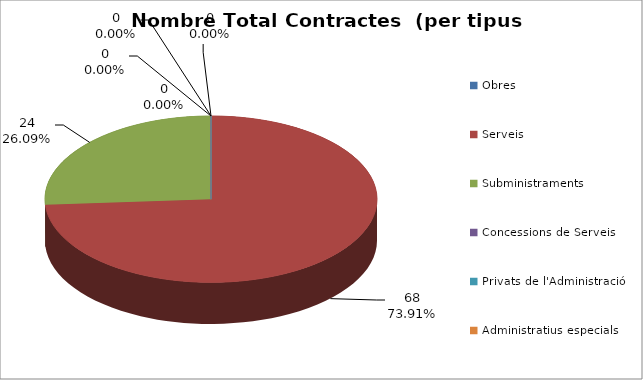
| Category | Nombre Total Contractes |
|---|---|
| Obres | 0 |
| Serveis | 68 |
| Subministraments | 24 |
| Concessions de Serveis | 0 |
| Privats de l'Administració | 0 |
| Administratius especials | 0 |